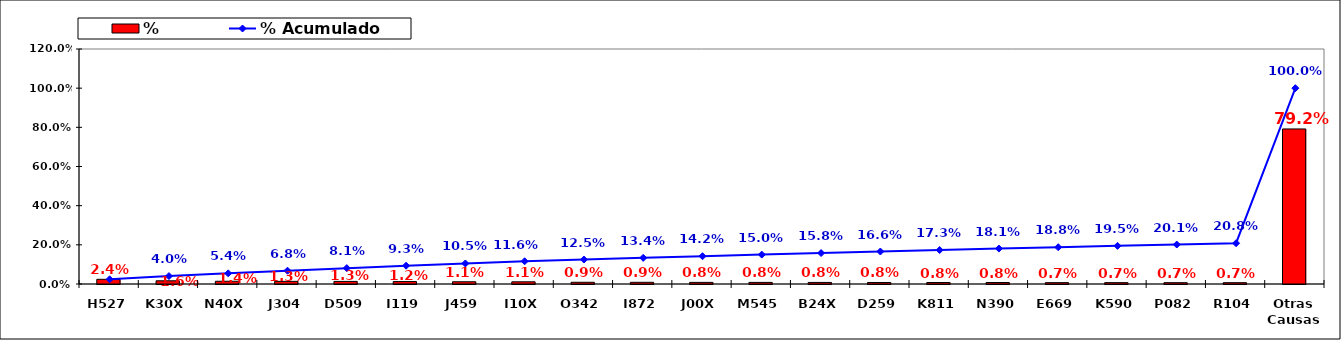
| Category | % |
|---|---|
| H527 | 0.024 |
| K30X | 0.016 |
| N40X | 0.014 |
| J304 | 0.013 |
| D509 | 0.013 |
| I119 | 0.012 |
| J459 | 0.011 |
| I10X | 0.011 |
| O342 | 0.009 |
| I872 | 0.009 |
| J00X | 0.008 |
| M545 | 0.008 |
| B24X | 0.008 |
| D259 | 0.008 |
| K811 | 0.008 |
| N390 | 0.008 |
| E669 | 0.007 |
| K590 | 0.007 |
| P082 | 0.007 |
| R104 | 0.007 |
| Otras Causas | 0.792 |